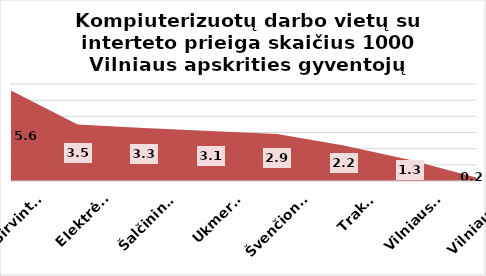
| Category | Series 0 |
|---|---|
| Širvintos | 5.6 |
| Elektrėnai | 3.5 |
| Šalčininkai | 3.28 |
| Ukmergė | 3.1 |
| Švenčionys | 2.9 |
| Trakai | 2.2 |
| Vilniaus r. | 1.3 |
| Vilniaus m. | 0.2 |